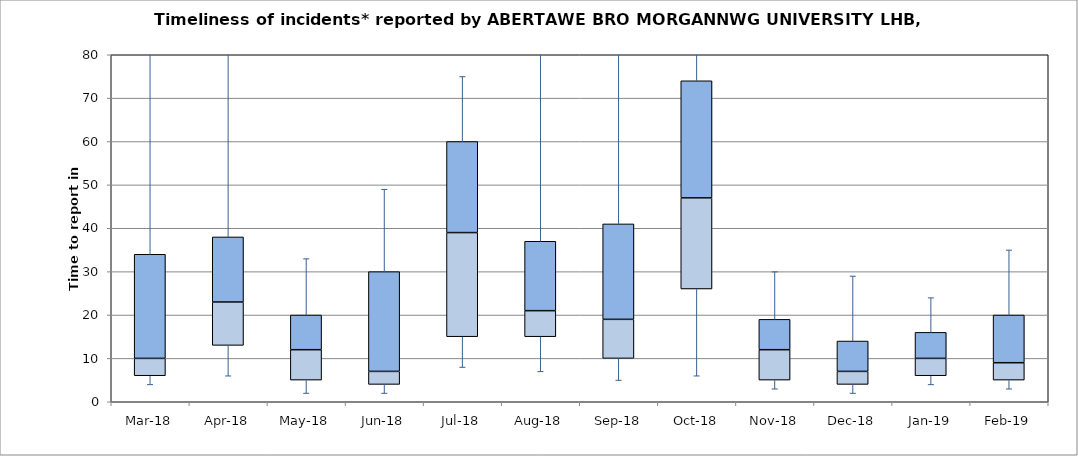
| Category | Series 0 | Series 1 | Series 2 |
|---|---|---|---|
| Mar-18 | 6 | 4 | 24 |
| Apr-18 | 13 | 10 | 15 |
| May-18 | 5 | 7 | 8 |
| Jun-18 | 4 | 3 | 23 |
| Jul-18 | 15 | 24 | 21 |
| Aug-18 | 15 | 6 | 16 |
| Sep-18 | 10 | 9 | 22 |
| Oct-18 | 26 | 21 | 27 |
| Nov-18 | 5 | 7 | 7 |
| Dec-18 | 4 | 3 | 7 |
| Jan-19 | 6 | 4 | 6 |
| Feb-19 | 5 | 4 | 11 |